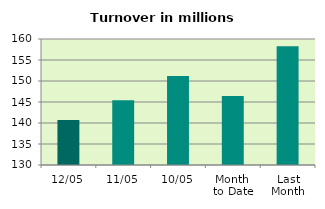
| Category | Series 0 |
|---|---|
| 12/05 | 140.689 |
| 11/05 | 145.393 |
| 10/05 | 151.21 |
| Month 
to Date | 146.399 |
| Last
Month | 158.303 |